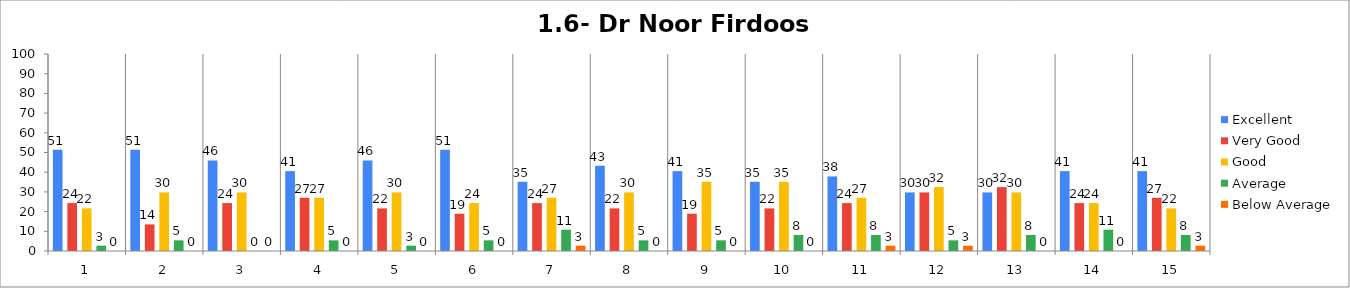
| Category | Excellent | Very Good | Good | Average | Below Average |
|---|---|---|---|---|---|
| 0 | 51.351 | 24.324 | 21.622 | 2.703 | 0 |
| 1 | 51.351 | 13.514 | 29.73 | 5.405 | 0 |
| 2 | 45.946 | 24.324 | 29.73 | 0 | 0 |
| 3 | 40.541 | 27.027 | 27.027 | 5.405 | 0 |
| 4 | 45.946 | 21.622 | 29.73 | 2.703 | 0 |
| 5 | 51.351 | 18.919 | 24.324 | 5.405 | 0 |
| 6 | 35.135 | 24.324 | 27.027 | 10.811 | 2.703 |
| 7 | 43.243 | 21.622 | 29.73 | 5.405 | 0 |
| 8 | 40.541 | 18.919 | 35.135 | 5.405 | 0 |
| 9 | 35.135 | 21.622 | 35.135 | 8.108 | 0 |
| 10 | 37.838 | 24.324 | 27.027 | 8.108 | 2.703 |
| 11 | 29.73 | 29.73 | 32.432 | 5.405 | 2.703 |
| 12 | 29.73 | 32.432 | 29.73 | 8.108 | 0 |
| 13 | 40.541 | 24.324 | 24.324 | 10.811 | 0 |
| 14 | 40.541 | 27.027 | 21.622 | 8.108 | 2.703 |